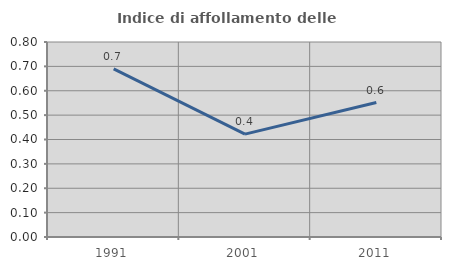
| Category | Indice di affollamento delle abitazioni  |
|---|---|
| 1991.0 | 0.69 |
| 2001.0 | 0.422 |
| 2011.0 | 0.551 |